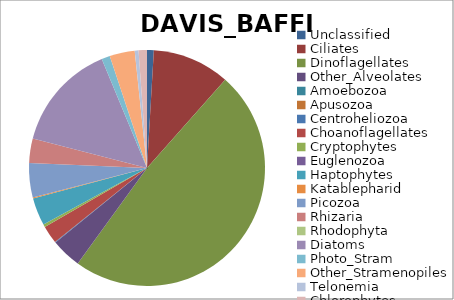
| Category | DAVIS_BAFFIN |
|---|---|
| Unclassified | 0.009 |
| Ciliates | 0.106 |
| Dinoflagellates | 0.485 |
| Other_Alveolates | 0.041 |
| Amoebozoa | 0 |
| Apusozoa | 0 |
| Centroheliozoa | 0.001 |
| Choanoflagellates | 0.024 |
| Cryptophytes | 0.004 |
| Euglenozoa | 0 |
| Haptophytes | 0.038 |
| Katablepharid | 0.001 |
| Picozoa | 0.047 |
| Rhizaria | 0.034 |
| Rhodophyta | 0 |
| Diatoms | 0.147 |
| Photo_Stram | 0.012 |
| Other_Stramenopiles | 0.034 |
| Telonemia | 0.005 |
| Chlorophytes | 0.011 |